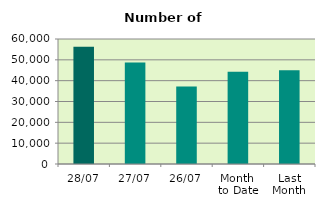
| Category | Series 0 |
|---|---|
| 28/07 | 56328 |
| 27/07 | 48690 |
| 26/07 | 37192 |
| Month 
to Date | 44286.8 |
| Last
Month | 45009.909 |